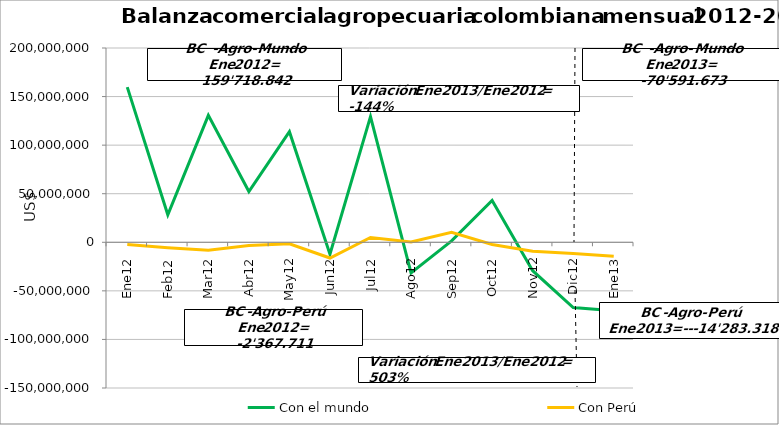
| Category | Con el mundo | Con Perú |
|---|---|---|
| 0 | 159718841.64 | -2367710.95 |
| 1 | 28365041.12 | -5551937.14 |
| 2 | 130703974.8 | -8151716.78 |
| 3 | 52247918.23 | -3242389.25 |
| 4 | 113869717.7 | -1603804.65 |
| 5 | -12237480.38 | -16182839.48 |
| 6 | 129307528.98 | 4983058.49 |
| 7 | -31469442.96 | 419290.76 |
| 8 | 1432914.69 | 10247211.16 |
| 9 | 43090007.69 | -2223908.25 |
| 10 | -29233824.97 | -9293421.9 |
| 11 | -67196777.37 | -11458529.5 |
| 12 | -70591672.64 | -14283318.17 |